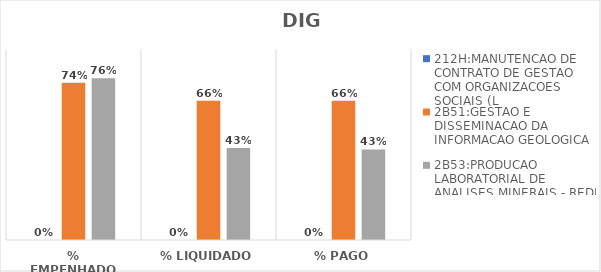
| Category | 212H:MANUTENCAO DE CONTRATO DE GESTAO COM ORGANIZACOES SOCIAIS (L | 2B51:GESTAO E DISSEMINACAO DA INFORMACAO GEOLOGICA | 2B53:PRODUCAO LABORATORIAL DE ANALISES MINERAIS - REDE LAMIN |
|---|---|---|---|
| % EMPENHADO | 0 | 0.741 | 0.762 |
| % LIQUIDADO | 0 | 0.656 | 0.434 |
| % PAGO | 0 | 0.656 | 0.427 |